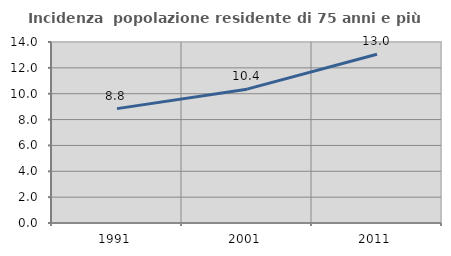
| Category | Incidenza  popolazione residente di 75 anni e più |
|---|---|
| 1991.0 | 8.847 |
| 2001.0 | 10.352 |
| 2011.0 | 13.048 |